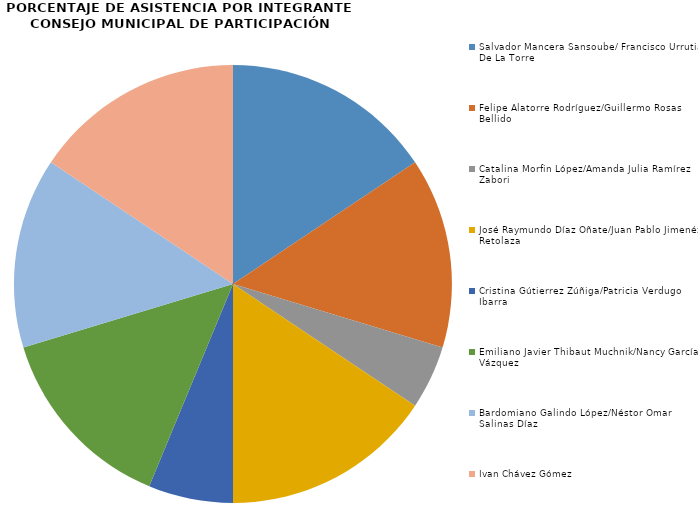
| Category | Series 0 |
|---|---|
| Salvador Mancera Sansoube/ Francisco Urrutia De La Torre | 10 |
| Felipe Alatorre Rodríguez/Guillermo Rosas Bellido | 9 |
| Catalina Morfin López/Amanda Julia Ramírez Zabori | 3 |
| José Raymundo Díaz Oñate/Juan Pablo Jimenéz Retolaza | 10 |
| Cristina Gútierrez Zúñiga/Patricia Verdugo Ibarra | 4 |
| Emiliano Javier Thibaut Muchnik/Nancy García Vázquez | 9 |
| Bardomiano Galindo López/Néstor Omar Salinas Díaz | 9 |
| Ivan Chávez Gómez | 10 |